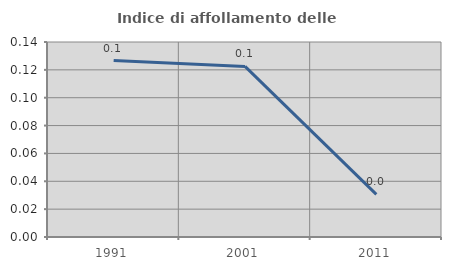
| Category | Indice di affollamento delle abitazioni  |
|---|---|
| 1991.0 | 0.127 |
| 2001.0 | 0.122 |
| 2011.0 | 0.031 |